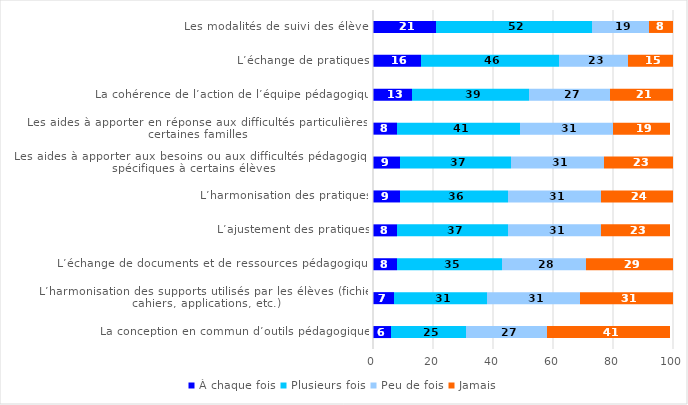
| Category | À chaque fois | Plusieurs fois | Peu de fois | Jamais |
|---|---|---|---|---|
| Les modalités de suivi des élèves | 21 | 52 | 19 | 8 |
| L’échange de pratiques | 16 | 46 | 23 | 15 |
| La cohérence de l’action de l’équipe pédagogique | 13 | 39 | 27 | 21 |
| Les aides à apporter en réponse aux difficultés particulières de certaines familles | 8 | 41 | 31 | 19 |
| Les aides à apporter aux besoins ou aux difficultés pédagogiques spécifiques à certains élèves | 9 | 37 | 31 | 23 |
| L’harmonisation des pratiques | 9 | 36 | 31 | 24 |
| L’ajustement des pratiques | 8 | 37 | 31 | 23 |
| L’échange de documents et de ressources pédagogiques | 8 | 35 | 28 | 29 |
| L’harmonisation des supports utilisés par les élèves (fichiers, cahiers, applications, etc.) | 7 | 31 | 31 | 31 |
| La conception en commun d’outils pédagogiques | 6 | 25 | 27 | 41 |